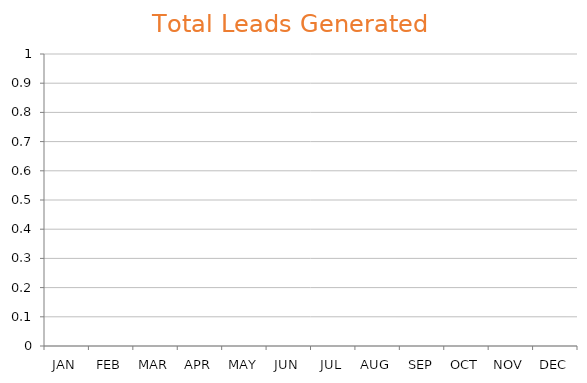
| Category | Total |
|---|---|
| JAN | 0 |
| FEB | 0 |
| MAR | 0 |
| APR | 0 |
| MAY | 0 |
| JUN | 0 |
| JUL | 0 |
| AUG | 0 |
| SEP | 0 |
| OCT | 0 |
| NOV | 0 |
| DEC | 0 |